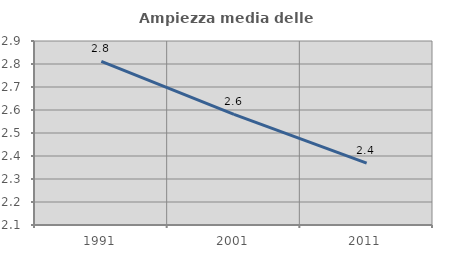
| Category | Ampiezza media delle famiglie |
|---|---|
| 1991.0 | 2.811 |
| 2001.0 | 2.581 |
| 2011.0 | 2.369 |